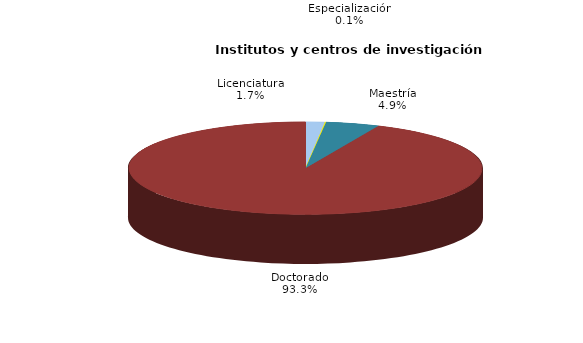
| Category | Series 0 |
|---|---|
| Licenciatura | 16 |
| Especialización | 1 |
| Maestría | 45 |
| Doctorado | 860 |